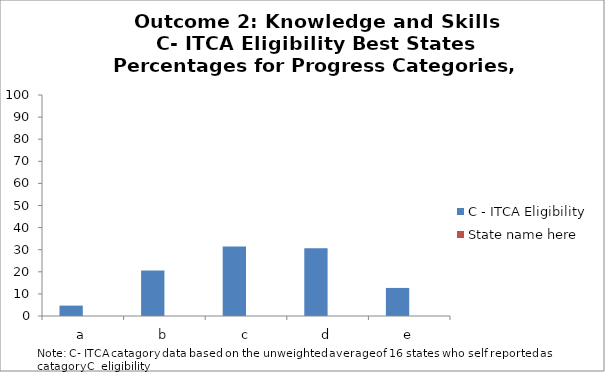
| Category | C - ITCA Eligibility | State name here |
|---|---|---|
| a | 4.7 |  |
| b | 20.6 |  |
| c | 31.4 |  |
| d | 30.7 |  |
| e | 12.7 |  |